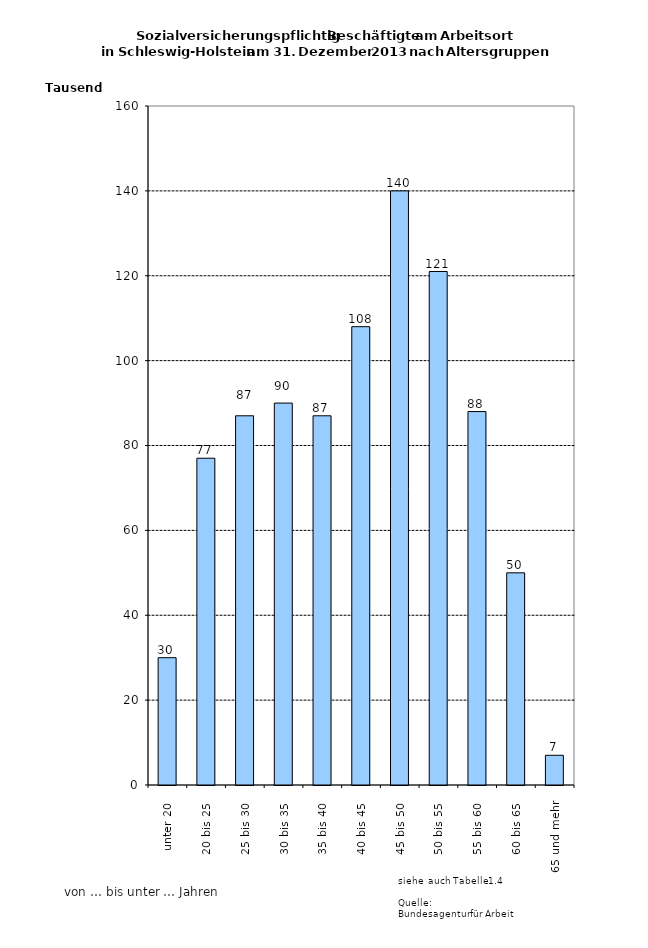
| Category | Series 0 |
|---|---|
| unter 20 | 30000 |
| 20 bis 25 | 77000 |
| 25 bis 30 | 87000 |
| 30 bis 35 | 90000 |
| 35 bis 40 | 87000 |
| 40 bis 45 | 108000 |
| 45 bis 50 | 140000 |
| 50 bis 55 | 121000 |
| 55 bis 60 | 88000 |
| 60 bis 65 | 50000 |
| 65 und mehr | 7000 |